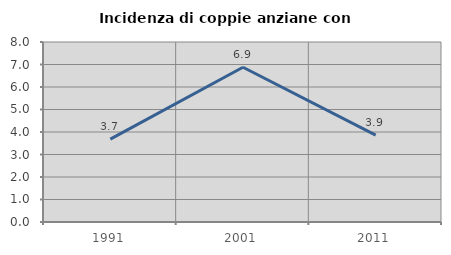
| Category | Incidenza di coppie anziane con figli |
|---|---|
| 1991.0 | 3.686 |
| 2001.0 | 6.877 |
| 2011.0 | 3.86 |